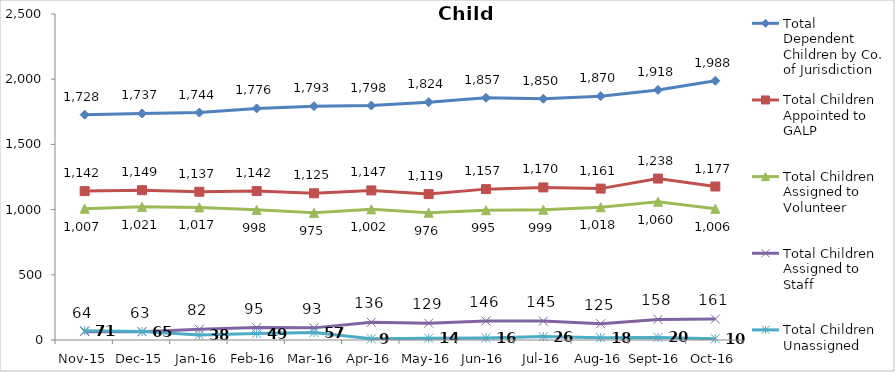
| Category | Total Dependent Children by Co. of Jurisdiction | Total Children Appointed to GALP | Total Children Assigned to Volunteer | Total Children Assigned to Staff | Total Children Unassigned |
|---|---|---|---|---|---|
| Nov-15 | 1728 | 1142 | 1007 | 64 | 71 |
| Dec-15 | 1737 | 1149 | 1021 | 63 | 65 |
| Jan-16 | 1744 | 1137 | 1017 | 82 | 38 |
| Feb-16 | 1776 | 1142 | 998 | 95 | 49 |
| Mar-16 | 1793 | 1125 | 975 | 93 | 57 |
| Apr-16 | 1798 | 1147 | 1002 | 136 | 9 |
| May-16 | 1824 | 1119 | 976 | 129 | 14 |
| Jun-16 | 1857 | 1157 | 995 | 146 | 16 |
| Jul-16 | 1850 | 1170 | 999 | 145 | 26 |
| Aug-16 | 1870 | 1161 | 1018 | 125 | 18 |
| Sep-16 | 1918 | 1238 | 1060 | 158 | 20 |
| Oct-16 | 1988 | 1177 | 1006 | 161 | 10 |